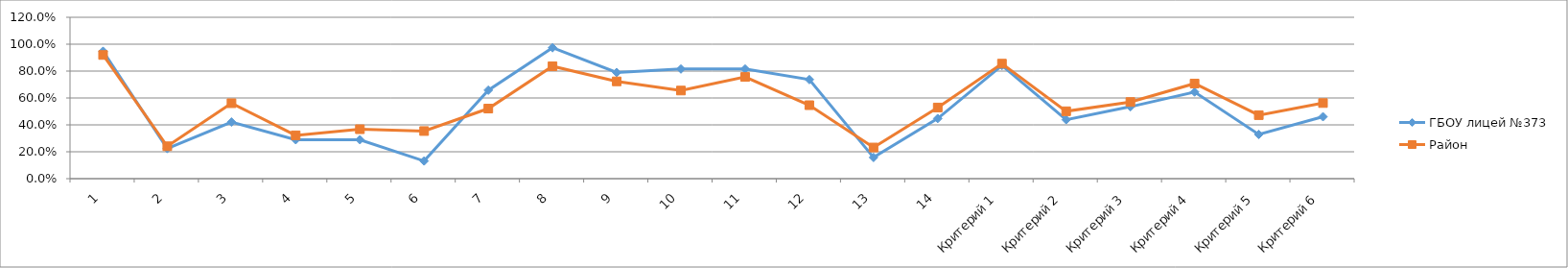
| Category | ГБОУ лицей №373 | Район |
|---|---|---|
| 1 | 0.947 | 0.92 |
| 2 | 0.224 | 0.241 |
| 3 | 0.421 | 0.561 |
| 4 | 0.289 | 0.322 |
| 5 | 0.289 | 0.368 |
| 6 | 0.132 | 0.354 |
| 7 | 0.658 | 0.521 |
| 8 | 0.974 | 0.836 |
| 9 | 0.789 | 0.723 |
| 10 | 0.816 | 0.655 |
| 11 | 0.816 | 0.756 |
| 12 | 0.737 | 0.546 |
| 13 | 0.158 | 0.232 |
| 14 | 0.447 | 0.529 |
| Критерий 1 | 0.842 | 0.855 |
| Критерий 2 | 0.439 | 0.501 |
| Критерий 3 | 0.535 | 0.57 |
| Критерий 4 | 0.645 | 0.707 |
| Критерий 5 | 0.329 | 0.472 |
| Критерий 6 | 0.461 | 0.562 |